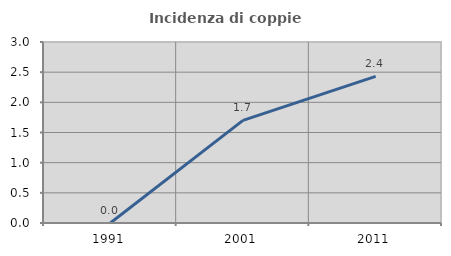
| Category | Incidenza di coppie miste |
|---|---|
| 1991.0 | 0 |
| 2001.0 | 1.701 |
| 2011.0 | 2.431 |